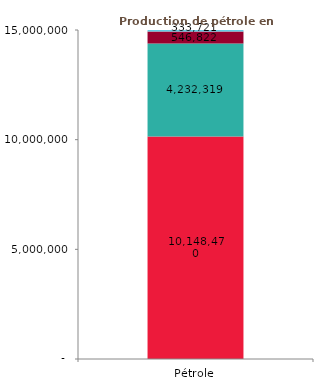
| Category | Kole | Lokele | Ebome | Moudi |
|---|---|---|---|---|
| Pétrole | 10148470 | 4232318.8 | 546822.1 | 333720.5 |